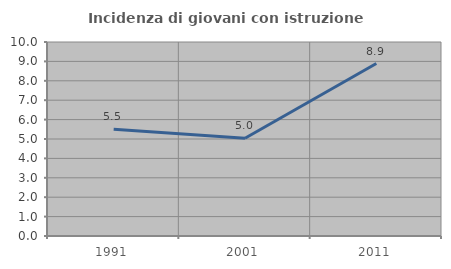
| Category | Incidenza di giovani con istruzione universitaria |
|---|---|
| 1991.0 | 5.505 |
| 2001.0 | 5.036 |
| 2011.0 | 8.889 |